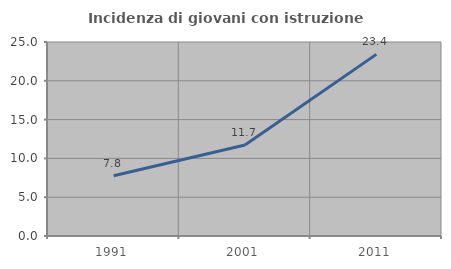
| Category | Incidenza di giovani con istruzione universitaria |
|---|---|
| 1991.0 | 7.77 |
| 2001.0 | 11.719 |
| 2011.0 | 23.404 |